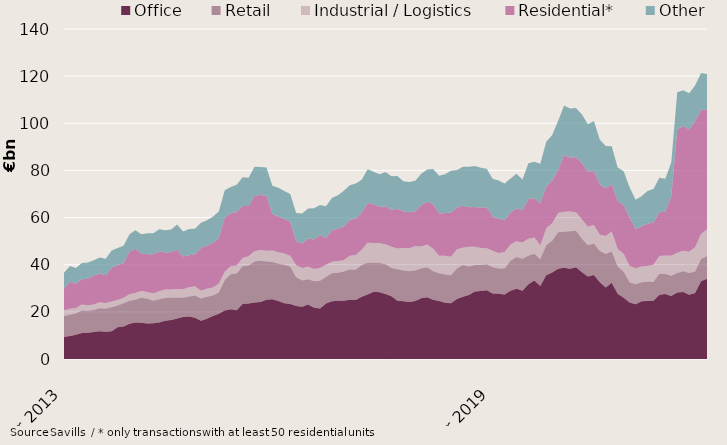
| Category | Office | Retail | Industrial / Logistics | Residential* | Other |
|---|---|---|---|---|---|
| 2013-03-01 | 9382899317.14 | 8879175776.35 | 2448956640.7 | 9229456528.32 | 6668642236.18 |
| 2013-04-01 | 9737865550.14 | 9085115744.35 | 2505676640.7 | 11400620541.32 | 6675635417.18 |
| 2013-05-01 | 10330473308.14 | 9039419099.35 | 2286696652.7 | 10308183683.48 | 6691277053.18 |
| 2013-06-01 | 10978757530.14 | 9577681151.78 | 2561696079.7 | 10738835935.44 | 6889015860.68 |
| 2013-07-01 | 11142986962.92 | 9286443584.78 | 2380046000.7 | 11240541620.44 | 6860571232.45 |
| 2013-08-01 | 11443046924.92 | 9376730772.8 | 2332457290 | 12229839822.44 | 6523458565.93 |
| 2013-09-01 | 11813118125.72 | 9699402869.51 | 2519207211.98 | 12284101856.74 | 6702053323.89 |
| 2013-10-01 | 11609579110.72 | 9727861863.57 | 2441069185.98 | 11727008984.54 | 6999037430.89 |
| 2013-11-01 | 11823434614.72 | 10122530032.36 | 2430937190.98 | 14361489005.63 | 7242529719.86 |
| 2013-12-01 | 13486314866.72 | 9187102030.91 | 2347240569.98 | 14839189260.74 | 7207107913.45 |
| 2014-01-01 | 13780730877.72 | 9851068493.92 | 2318485717.98 | 14690274441.74 | 7445499336.45 |
| 2014-02-01 | 15007305331.22 | 9673463303.24 | 2768349976.98 | 18105536458.24 | 7410903668.17 |
| 2014-03-01 | 15491487872.58 | 9654351125.74 | 2833117356.98 | 18788331922.24 | 7865305632.17 |
| 2014-04-01 | 15374141977.58 | 10607660669.74 | 2834100536.98 | 15912594110.24 | 8156058838.17 |
| 2014-05-01 | 15060894833.58 | 10546963482.24 | 2845864408.98 | 15985891426.24 | 8912269938.17 |
| 2014-06-01 | 15158218425.66 | 9544432647.24 | 3105506584.98 | 16600111315.18 | 8957481288.38 |
| 2014-07-01 | 15478732963.88 | 9841966235.24 | 3440852401.98 | 16949735532.68 | 9348736034.61 |
| 2014-08-01 | 16232650242.88 | 9636967715.24 | 3573059549.98 | 15601635374.68 | 9537173270.13 |
| 2014-09-01 | 16583059928.08 | 9353804856.84 | 3506391505.5 | 15963260713.68 | 9536363131.17 |
| 2014-10-01 | 17213987967.08 | 8866837530.84 | 3656699955.5 | 16628034819.88 | 10688452074.17 |
| 2014-11-01 | 17844374967.08 | 8117398128.05 | 3665328905.5 | 13878849559.89 | 10536862158.2 |
| 2014-12-01 | 18081725689.74 | 8390279963.03 | 3920968980.31 | 13670541413.41 | 11111775796.81 |
| 2015-01-01 | 17480642203.74 | 9466254593.03 | 3883908572.31 | 13646785050.41 | 10792640236.82 |
| 2015-02-01 | 16274240230.74 | 9403790983.81 | 3308490268.73 | 18150436996.91 | 10711659377.05 |
| 2015-03-01 | 17035308030.53 | 9365302106.81 | 3368654245.73 | 18257100941.91 | 10814665093.98 |
| 2015-04-01 | 18258922782.53 | 8632001669.81 | 3468694360.68 | 18830450268.91 | 11160418925.98 |
| 2015-05-01 | 19244040473.45 | 8968092469.31 | 3728635607.68 | 19401993150.91 | 11206086418.98 |
| 2015-06-01 | 20628774084.83 | 12835460483.14 | 3559231021.83 | 22972449786.51 | 11551008084.75 |
| 2015-07-01 | 21112087532.5 | 14845940919.21 | 3371725415.86 | 22540107592.35 | 11120198096.21 |
| 2015-08-01 | 20695261632.5 | 15562941505.21 | 3450767146.86 | 22635118357.35 | 11596269263.21 |
| 2015-09-01 | 23317313452.46 | 16001092585.73 | 3520511283.36 | 22065141963.35 | 12239394888.21 |
| 2015-10-01 | 23516812856.46 | 16181040556.36 | 3919085482.36 | 21292965650.35 | 11947737369.21 |
| 2015-11-01 | 23972463618.14 | 17339041737.5 | 4397719316.13 | 23395398176.29 | 12403799285.38 |
| 2015-12-01 | 24223428696.48 | 17455198961.04 | 4557113724.92 | 23319336016.77 | 11921836396.75 |
| 2016-01-01 | 25174915627.48 | 16138997225.45 | 4662502872.92 | 23277671921.77 | 11967817247.24 |
| 2016-02-01 | 25329929348.53 | 15820090497.99 | 4833139363.87 | 15563498654.77 | 11947811922.01 |
| 2016-03-01 | 24570059201.74 | 15865699828.72 | 4877967507.07 | 15108592339.77 | 12258738527.08 |
| 2016-04-01 | 23703143104.74 | 16254770286.07 | 4833846127.82 | 14760671477.37 | 11696815742.08 |
| 2016-05-01 | 23294206506.82 | 15809944380.07 | 4749671116.82 | 14232081715.37 | 11919414936.04 |
| 2016-06-01 | 22501572843.36 | 12232494883.06 | 4999570420.67 | 10189436595.87 | 11965206341.06 |
| 2016-07-01 | 22191433924.69 | 11125435985.56 | 5312245465.64 | 10404072475.53 | 12714721035.96 |
| 2016-08-01 | 23095572073.69 | 10745638868.56 | 5247332254.55 | 12050427222.53 | 12760471635.96 |
| 2016-09-01 | 21794742253.73 | 11145401725.47 | 5270185116.55 | 12465620399.13 | 13320393986.26 |
| 2016-10-01 | 21450269446.86 | 11739208168.84 | 5398267322.55 | 14070034790.02 | 12669133056.83 |
| 2016-11-01 | 23506003086.76 | 11238716740.7 | 5243284144.73 | 11380146617.09 | 13425196679.66 |
| 2016-12-01 | 24468092228.4 | 11930870429.99 | 4886851002.13 | 13331201908.09 | 13681375420.64 |
| 2017-01-01 | 24675768593.4 | 11942263686.96 | 4921244810.37 | 13729696509.09 | 14250866691.58 |
| 2017-02-01 | 24713389622.41 | 12356472437.09 | 4839285725 | 14267858145.09 | 15185668584.58 |
| 2017-03-01 | 25170261511.4 | 12765732178.37 | 5896154543.8 | 15167920484.39 | 14747708325.58 |
| 2017-04-01 | 25008250661.71 | 12830910576.9 | 6258560580.1 | 15489114794.79 | 14851969486.67 |
| 2017-05-01 | 26420856083.47 | 13492885630.15 | 6480202097.1 | 15522287182.8 | 14083438590.28 |
| 2017-06-01 | 27359198504.1 | 13451943478.5 | 8559046401.46 | 16801850396.39 | 14298214208.56 |
| 2017-07-01 | 28566083298.1 | 12300139347.93 | 8320632158.46 | 16480355706.39 | 13778769706.2 |
| 2017-08-01 | 28285172977.1 | 12408029136.93 | 8383195707.55 | 15442529308.39 | 13849134751.2 |
| 2017-09-01 | 27607830483.45 | 12616830917.94 | 8506558041.55 | 16123359085.78 | 14486501554.74 |
| 2017-10-01 | 26661153964.32 | 11909960273.94 | 9044546430.46 | 15580068614.87 | 14351240861.17 |
| 2017-11-01 | 24728535385.17 | 13314421843.83 | 8799447546.51 | 16947694524.87 | 13849490657.44 |
| 2017-12-01 | 24513417630.53 | 13078578236.48 | 9470343512.7 | 15610704960.87 | 12759017527.48 |
| 2018-01-01 | 24219024273.53 | 13013700645.1 | 9721702683.46 | 15307451168.86 | 12872295093.04 |
| 2018-02-01 | 24590947510.47 | 12985537030.65 | 10213193365.46 | 14917009796.86 | 12890336189.04 |
| 2018-03-01 | 25772438266.48 | 12663577036.64 | 9307934893.46 | 17524767231.49 | 13297726597.02 |
| 2018-04-01 | 26239260459.17 | 12722345110.76 | 9605919650.46 | 18204136136.49 | 13654710808.93 |
| 2018-05-01 | 25176840173.41 | 12092663746.51 | 9488564046.46 | 19015064846.48 | 14830516074.36 |
| 2018-06-01 | 24619805985.78 | 11810463263.34 | 7330050155.1 | 17955943579.56 | 16022655962.08 |
| 2018-07-01 | 23897232823.78 | 11960863126.32 | 7966869588.1 | 18082211683.56 | 16514108766.19 |
| 2018-08-01 | 23631217227.76 | 11885701905.19 | 7898300709.1 | 18779877058.41 | 17667527641.04 |
| 2018-09-01 | 25478200690.41 | 12927853979.55 | 8136141438.1 | 17594307591.42 | 15998426541.21 |
| 2018-10-01 | 26428322940.41 | 13398765782.82 | 7412735586.25 | 17806279798.32 | 16500489800.21 |
| 2018-11-01 | 27102721403.45 | 12145908934.88 | 8401198728.54 | 16739676352.32 | 17199430194.25 |
| 2018-12-01 | 28655175031.45 | 11248285254.68 | 7673095490.35 | 16903534102.32 | 17410832515.26 |
| 2019-01-01 | 28881677192.45 | 10984616615.68 | 7220623719.35 | 17089851283.2 | 17011641609.26 |
| 2019-02-01 | 29153984861.45 | 10992187442.4 | 6837562259.96 | 17443099230.2 | 16288670799.62 |
| 2019-03-01 | 27779834171.45 | 11171202657.26 | 6991519187.16 | 14403850111.27 | 16138588186.64 |
| 2019-04-01 | 27660063728.31 | 10721779269.12 | 6440787186.06 | 14819462716.14 | 16122027674.89 |
| 2019-05-01 | 27411606224.31 | 11007377577.12 | 6930931752.06 | 13546461129.14 | 15591702370.89 |
| 2019-06-01 | 28981375466.82 | 12738169920.09 | 6808322697.06 | 13582021303.47 | 14498193682.96 |
| 2019-07-01 | 29836478466.29 | 13385300761.26 | 6721738121.06 | 13965040868.47 | 14698594837.92 |
| 2019-08-01 | 28932944882.31 | 13638029313.39 | 6847156982.06 | 13700485358.62 | 13056753149.07 |
| 2019-09-01 | 31740495687.25 | 12091023494.97 | 7236155171.92 | 16808223801.62 | 15208053471.17 |
| 2019-10-01 | 33266807249.25 | 11371608887.7 | 6870917898.86 | 16650274404.74 | 15543023722.17 |
| 2019-11-01 | 30998345096.78 | 11335647756.75 | 5862593126.57 | 17999098699.74 | 16608257247.86 |
| 2019-12-01 | 35527691128.49 | 12748435551.88 | 7193076149.23 | 17715667348.74 | 18988776442.82 |
| 2020-01-01 | 36701466860.49 | 13455205119.88 | 7418333450.23 | 18152920102.87 | 19298443060.82 |
| 2020-02-01 | 38253570613.44 | 15518583828.37 | 8118849336.38 | 18347811221.37 | 20876955510.54 |
| 2020-03-01 | 38661114818.89 | 15361758647.15 | 8435638262.18 | 24034093487.37 | 21087830921.12 |
| 2020-04-01 | 38306762938.03 | 15876632879.17 | 8421581433.28 | 22892151936.5 | 20818918971.87 |
| 2020-05-01 | 38874029574.03 | 15517202993.17 | 7833704033.28 | 23320141777.5 | 20907392846.83 |
| 2020-06-01 | 36825932126.52 | 14166673820.21 | 8153642308.28 | 24041398462.5 | 20572849639.76 |
| 2020-07-01 | 35038901674.05 | 13206002556.06 | 7858106953.28 | 23454894941.5 | 20046619490.06 |
| 2020-08-01 | 35631965111.05 | 13340195992.06 | 7864692000.28 | 22961788157.5 | 21150990421.55 |
| 2020-09-01 | 32515990383.11 | 13251359673.68 | 6961195944.42 | 21430453702.49 | 18831855953.08 |
| 2020-10-01 | 30357242112.11 | 14173883253.68 | 7625238129.42 | 20314229725.49 | 17841894371.54 |
| 2020-11-01 | 32387193464.11 | 13264654126.68 | 8422802908.42 | 20031748385.49 | 16141331591.98 |
| 2020-12-01 | 27661146779.4 | 11619042101.74 | 7340810853.76 | 20448638435.49 | 14201491952.88 |
| 2021-01-01 | 25978755162.4 | 11039497747.74 | 7676907719.76 | 20652659315.49 | 14332310879.79 |
| 2021-02-01 | 23996936055.45 | 8570163915.53 | 6938860723 | 20660784697.99 | 12691501255.47 |
| 2021-03-01 | 23196412137 | 8486914457.89 | 6789691146.99 | 16596692848.99 | 12452530480.25 |
| 2021-04-01 | 24453392320 | 8077653506.01 | 6669014867.99 | 17144667013.99 | 12679964254.25 |
| 2021-05-01 | 24593933088 | 8205436491.01 | 6688135128.99 | 17908984016.99 | 13895802709.29 |
| 2021-06-01 | 24732396945 | 7883145938 | 7330984208.99 | 17975040212.99 | 14206833508.91 |
| 2021-07-01 | 27303333580 | 8852856187 | 7562676605.99 | 18534669487.74 | 14615930910.54 |
| 2021-08-01 | 27573905655 | 8481290112 | 7850085331.96 | 18650239563.74 | 13870941223.05 |
| 2021-09-01 | 26778683918 | 8553667780.91 | 8421743830.96 | 25378180018.75 | 14293773303.41 |
| 2021-10-01 | 28175597365.69 | 8265460390.91 | 8613080520.96 | 52349288139.75 | 15731241646.32 |
| 2021-11-01 | 28459393963.69 | 8783342566.91 | 8675090834.96 | 52964740980.75 | 15126402688.88 |
| 2021-12-01 | 27307850672.69 | 9135901841.07 | 9015197684.96 | 51940174280.25 | 15327302394.02 |
| 2022-01-01 | 27966578909.69 | 9150085506.07 | 10312587571.97 | 53578641431.25 | 14977495944.11 |
| 2022-02-01 | 32962212557.24 | 9423928851.13 | 10606907643.97 | 52742367288.79 | 15582424312.21 |
| 2022-03-01 | 34039557194.27 | 9635595726.43 | 11213180614.93 | 50736091722.79 | 15304475484.52 |